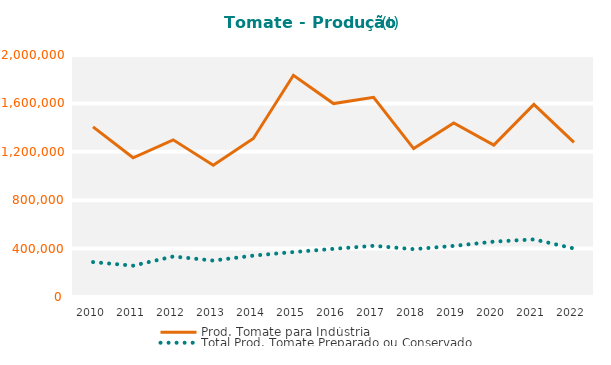
| Category | Prod. Tomate para Indústria | Total Prod. Tomate Preparado ou Conservado |
|---|---|---|
| 2010 | 1406084 | 288574.445 |
| 2011 | 1150827 | 258945.188 |
| 2012 | 1298902 | 334962.085 |
| 2013 | 1089501 | 301141.906 |
| 2014 | 1310366 | 342083.365 |
| 2015 | 1832467 | 371568.133 |
| 2016 | 1598398 | 397824.869 |
| 2017 | 1650429 | 423103.445 |
| 2018 | 1226828 | 395304.624 |
| 2019 | 1438848 | 422193.386 |
| 2020 | 1255298 | 457599.419 |
| 2021 | 1591328 | 476082.889 |
| 2022 | 1278223 | 401058.99 |